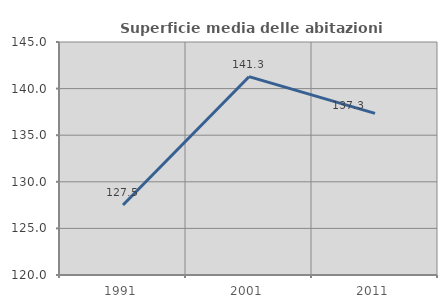
| Category | Superficie media delle abitazioni occupate |
|---|---|
| 1991.0 | 127.506 |
| 2001.0 | 141.279 |
| 2011.0 | 137.34 |